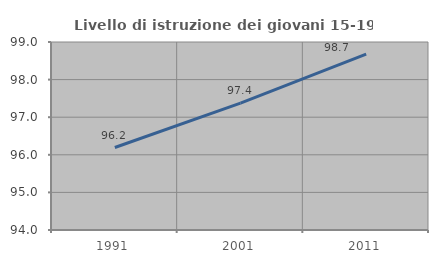
| Category | Livello di istruzione dei giovani 15-19 anni |
|---|---|
| 1991.0 | 96.194 |
| 2001.0 | 97.375 |
| 2011.0 | 98.677 |